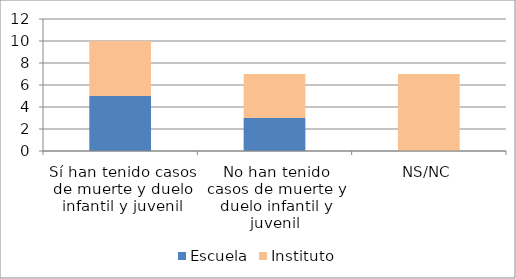
| Category | Escuela | Instituto |
|---|---|---|
| Sí han tenido casos de muerte y duelo infantil y juvenil | 5 | 5 |
| No han tenido casos de muerte y duelo infantil y juvenil | 3 | 4 |
| NS/NC | 0 | 7 |